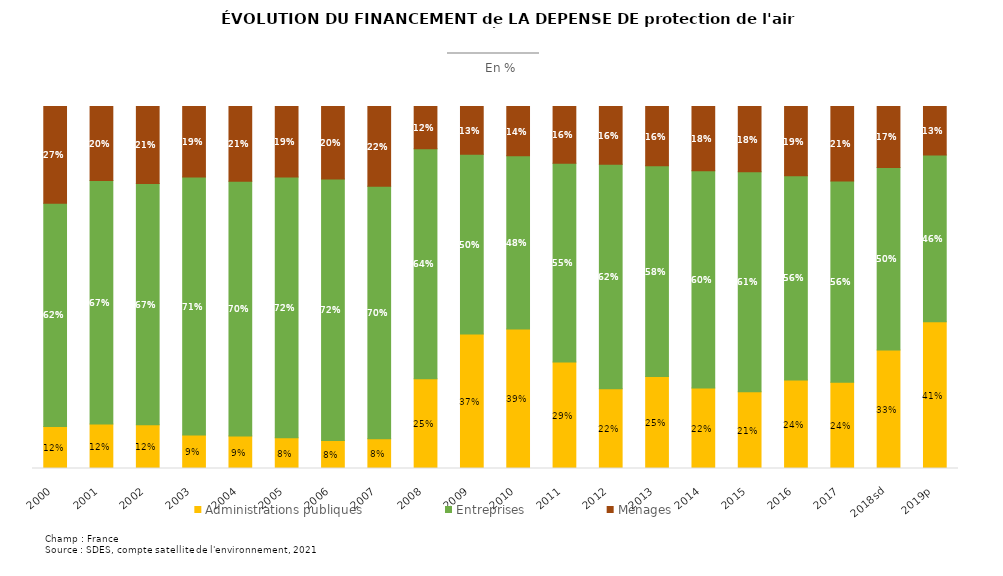
| Category | Administrations publiques | Entreprises | Ménages |
|---|---|---|---|
| 2000 | 0.116 | 0.617 | 0.267 |
| 2001 | 0.123 | 0.672 | 0.204 |
| 2002 | 0.121 | 0.667 | 0.213 |
| 2003 | 0.092 | 0.713 | 0.194 |
| 2004 | 0.09 | 0.704 | 0.206 |
| 2005 | 0.085 | 0.72 | 0.195 |
| 2006 | 0.077 | 0.723 | 0.2 |
| 2007 | 0.082 | 0.697 | 0.22 |
| 2008 | 0.248 | 0.635 | 0.117 |
| 2009 | 0.372 | 0.496 | 0.132 |
| 2010 | 0.385 | 0.479 | 0.136 |
| 2011 | 0.294 | 0.549 | 0.156 |
| 2012 | 0.221 | 0.62 | 0.159 |
| 2013 | 0.254 | 0.583 | 0.163 |
| 2014 | 0.222 | 0.6 | 0.177 |
| 2015 | 0.212 | 0.608 | 0.18 |
| 2016 | 0.245 | 0.564 | 0.191 |
| 2017 | 0.238 | 0.556 | 0.206 |
| 2018sd | 0.327 | 0.504 | 0.168 |
| 2019p | 0.405 | 0.461 | 0.134 |